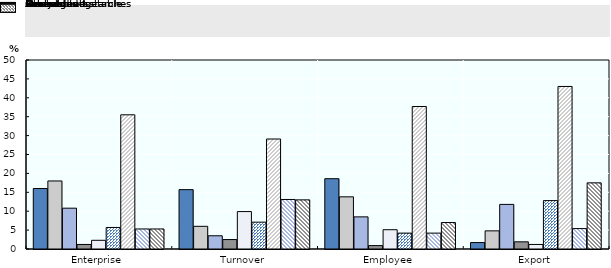
| Category | Meat | Seafood | Fruit and vegetable | Oils and fats | Dairy | Cereals and starches | Other food 1 | Animal feeds | Beverages |
|---|---|---|---|---|---|---|---|---|---|
| Enterprise | 16 | 18 | 10.8 | 1.2 | 2.3 | 5.7 | 35.5 | 5.3 | 5.3 |
| Turnover | 15.7 | 6 | 3.5 | 2.5 | 9.9 | 7.1 | 29.1 | 13.1 | 13 |
| Employee | 18.6 | 13.8 | 8.5 | 0.9 | 5.1 | 4.2 | 37.7 | 4.2 | 7 |
| Export | 1.7 | 4.8 | 11.8 | 1.9 | 1.2 | 12.8 | 43 | 5.4 | 17.5 |